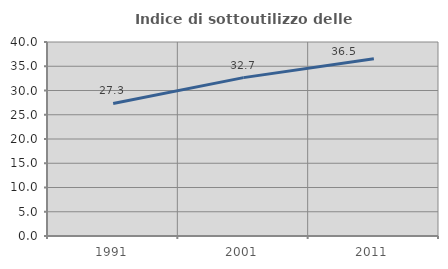
| Category | Indice di sottoutilizzo delle abitazioni  |
|---|---|
| 1991.0 | 27.336 |
| 2001.0 | 32.653 |
| 2011.0 | 36.538 |